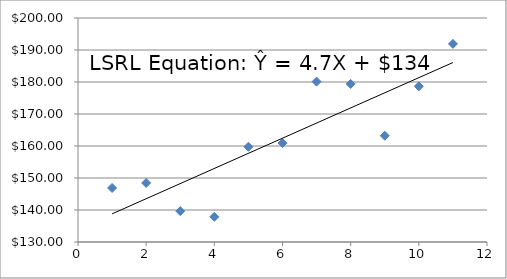
| Category | Series 0 |
|---|---|
| 1.0 | 146.89 |
| 2.0 | 148.45 |
| 3.0 | 139.65 |
| 4.0 | 137.87 |
| 5.0 | 159.76 |
| 6.0 | 160.91 |
| 7.0 | 180.12 |
| 8.0 | 179.4 |
| 9.0 | 163.21 |
| 10.0 | 178.67 |
| 11.0 | 191.92 |